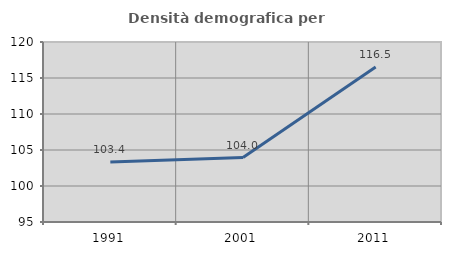
| Category | Densità demografica |
|---|---|
| 1991.0 | 103.35 |
| 2001.0 | 103.955 |
| 2011.0 | 116.515 |